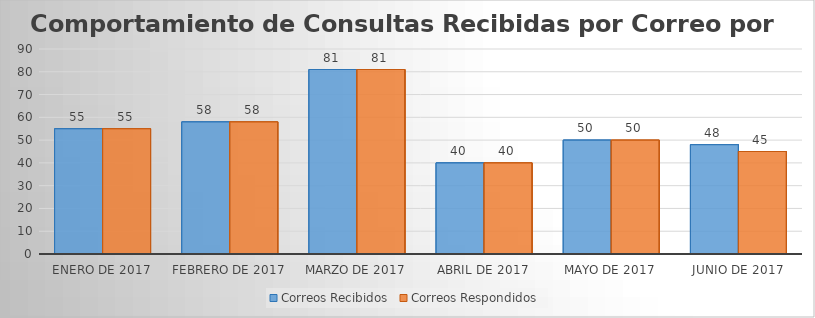
| Category | Correos Recibidos | Correos Respondidos |
|---|---|---|
| Enero de 2017 | 55 | 55 |
| Febrero de 2017 | 58 | 58 |
| Marzo de 2017 | 81 | 81 |
| Abril de 2017 | 40 | 40 |
| Mayo de 2017 | 50 | 50 |
| Junio de 2017 | 48 | 45 |